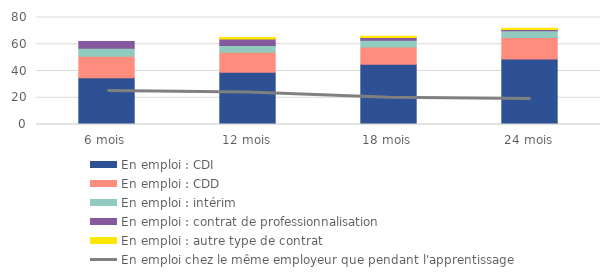
| Category | En emploi : CDI | En emploi : CDD | En emploi : intérim | En emploi : contrat de professionnalisation | En emploi : autre type de contrat |
|---|---|---|---|---|---|
| 6 mois | 35 | 16 | 6 | 5 | 0 |
| 12 mois | 39 | 15 | 5 | 5 | 1 |
| 18 mois | 45 | 13 | 5 | 2 | 1 |
| 24 mois | 49 | 16 | 5 | 1 | 1 |